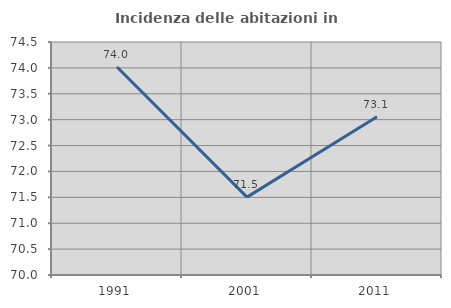
| Category | Incidenza delle abitazioni in proprietà  |
|---|---|
| 1991.0 | 74.017 |
| 2001.0 | 71.504 |
| 2011.0 | 73.055 |